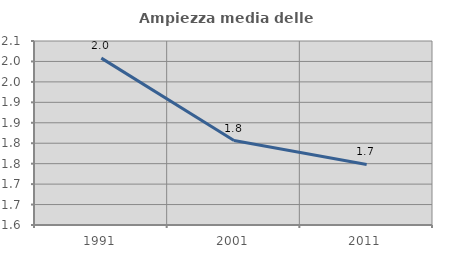
| Category | Ampiezza media delle famiglie |
|---|---|
| 1991.0 | 2.008 |
| 2001.0 | 1.806 |
| 2011.0 | 1.748 |